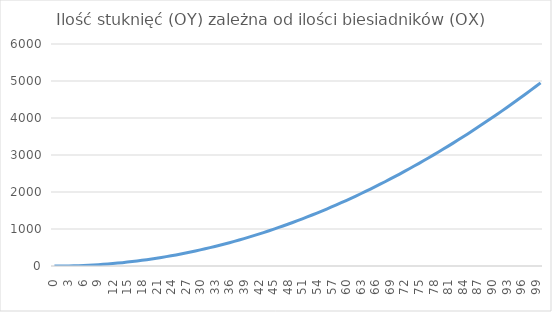
| Category | Series 0 |
|---|---|
| 0.0 | 0 |
| 1.0 | 0 |
| 2.0 | 1 |
| 3.0 | 3 |
| 4.0 | 6 |
| 5.0 | 10 |
| 6.0 | 15 |
| 7.0 | 21 |
| 8.0 | 28 |
| 9.0 | 36 |
| 10.0 | 45 |
| 11.0 | 55 |
| 12.0 | 66 |
| 13.0 | 78 |
| 14.0 | 91 |
| 15.0 | 105 |
| 16.0 | 120 |
| 17.0 | 136 |
| 18.0 | 153 |
| 19.0 | 171 |
| 20.0 | 190 |
| 21.0 | 210 |
| 22.0 | 231 |
| 23.0 | 253 |
| 24.0 | 276 |
| 25.0 | 300 |
| 26.0 | 325 |
| 27.0 | 351 |
| 28.0 | 378 |
| 29.0 | 406 |
| 30.0 | 435 |
| 31.0 | 465 |
| 32.0 | 496 |
| 33.0 | 528 |
| 34.0 | 561 |
| 35.0 | 595 |
| 36.0 | 630 |
| 37.0 | 666 |
| 38.0 | 703 |
| 39.0 | 741 |
| 40.0 | 780 |
| 41.0 | 820 |
| 42.0 | 861 |
| 43.0 | 903 |
| 44.0 | 946 |
| 45.0 | 990 |
| 46.0 | 1035 |
| 47.0 | 1081 |
| 48.0 | 1128 |
| 49.0 | 1176 |
| 50.0 | 1225 |
| 51.0 | 1275 |
| 52.0 | 1326 |
| 53.0 | 1378 |
| 54.0 | 1431 |
| 55.0 | 1485 |
| 56.0 | 1540 |
| 57.0 | 1596 |
| 58.0 | 1653 |
| 59.0 | 1711 |
| 60.0 | 1770 |
| 61.0 | 1830 |
| 62.0 | 1891 |
| 63.0 | 1953 |
| 64.0 | 2016 |
| 65.0 | 2080 |
| 66.0 | 2145 |
| 67.0 | 2211 |
| 68.0 | 2278 |
| 69.0 | 2346 |
| 70.0 | 2415 |
| 71.0 | 2485 |
| 72.0 | 2556 |
| 73.0 | 2628 |
| 74.0 | 2701 |
| 75.0 | 2775 |
| 76.0 | 2850 |
| 77.0 | 2926 |
| 78.0 | 3003 |
| 79.0 | 3081 |
| 80.0 | 3160 |
| 81.0 | 3240 |
| 82.0 | 3321 |
| 83.0 | 3403 |
| 84.0 | 3486 |
| 85.0 | 3570 |
| 86.0 | 3655 |
| 87.0 | 3741 |
| 88.0 | 3828 |
| 89.0 | 3916 |
| 90.0 | 4005 |
| 91.0 | 4095 |
| 92.0 | 4186 |
| 93.0 | 4278 |
| 94.0 | 4371 |
| 95.0 | 4465 |
| 96.0 | 4560 |
| 97.0 | 4656 |
| 98.0 | 4753 |
| 99.0 | 4851 |
| 100.0 | 4950 |